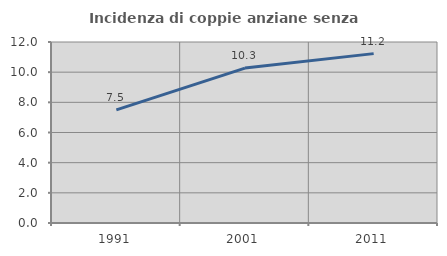
| Category | Incidenza di coppie anziane senza figli  |
|---|---|
| 1991.0 | 7.496 |
| 2001.0 | 10.27 |
| 2011.0 | 11.229 |